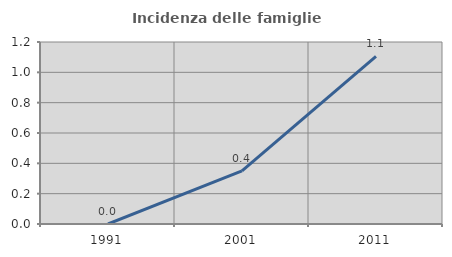
| Category | Incidenza delle famiglie numerose |
|---|---|
| 1991.0 | 0 |
| 2001.0 | 0.351 |
| 2011.0 | 1.106 |